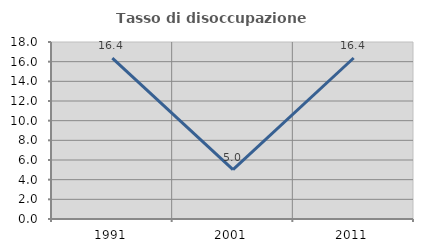
| Category | Tasso di disoccupazione giovanile  |
|---|---|
| 1991.0 | 16.369 |
| 2001.0 | 5.023 |
| 2011.0 | 16.374 |